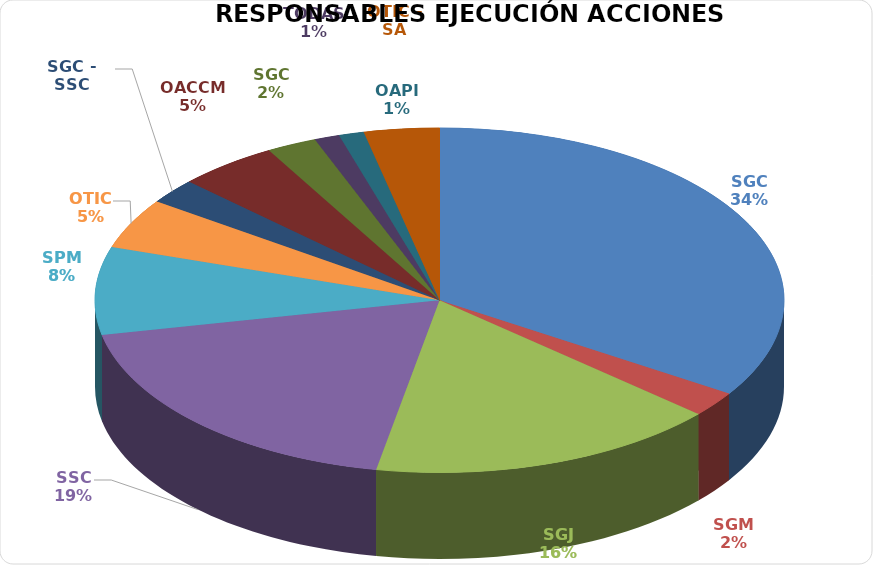
| Category | Series 0 |
|---|---|
| SGC | 29 |
| SGM | 2 |
| SGJ | 14 |
| SSC | 16 |
| SPM | 7 |
| OTIC | 4 |
| SGC - SSC | 2 |
| OACCM | 4 |
| SGC | 2 |
| TODAS | 1 |
| OAPI | 1 |
| OTIC - SA | 3 |